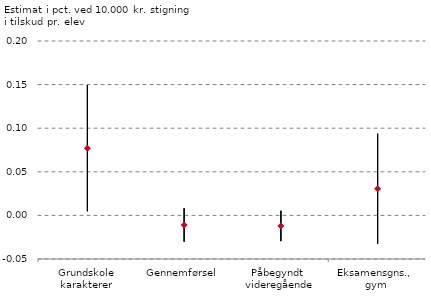
| Category | Serie 1 | Serie 2 | Serie 3 |
|---|---|---|---|
| Grundskole
karakterer | 0.149 | 0.005 | 0.077 |
| Gennemførsel | 0.008 | -0.03 | -0.011 |
| Påbegyndt 
videregående | 0.005 | -0.03 | -0.012 |
| Eksamensgns., 
gym | 0.094 | -0.033 | 0.031 |